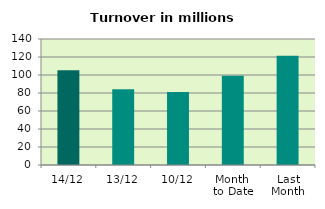
| Category | Series 0 |
|---|---|
| 14/12 | 105.178 |
| 13/12 | 84.193 |
| 10/12 | 80.98 |
| Month 
to Date | 99.252 |
| Last
Month | 121.455 |